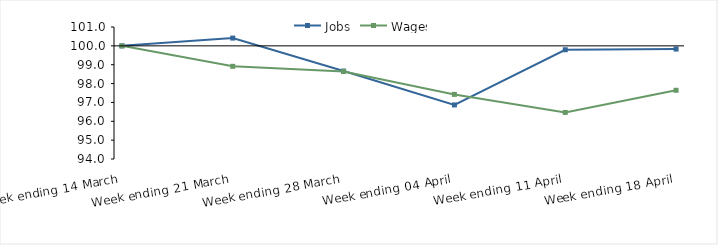
| Category | Jobs | Wages |
|---|---|---|
| 0 | 100 | 100 |
| 1900-01-01 | 100.412 | 98.915 |
| 1900-01-02 | 98.664 | 98.641 |
| 1900-01-03 | 96.867 | 97.426 |
| 1900-01-04 | 99.793 | 96.469 |
| 1900-01-05 | 99.832 | 97.645 |